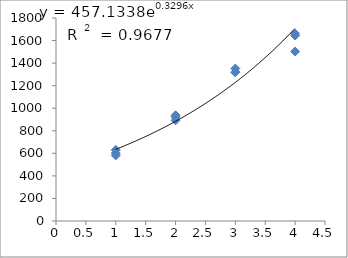
| Category | Series 0 |
|---|---|
| 1.0 | 630.54 |
| 1.0 | 581.035 |
| 1.0 | 601.879 |
| 2.0 | 937.298 |
| 2.0 | 892.665 |
| 2.0 | 920.561 |
| 3.0 | 1351.577 |
| 3.0 | 1319.65 |
| 3.0 | 1319.65 |
| 4.0 | 1502.488 |
| 4.0 | 1644.541 |
| 4.0 | 1660.932 |